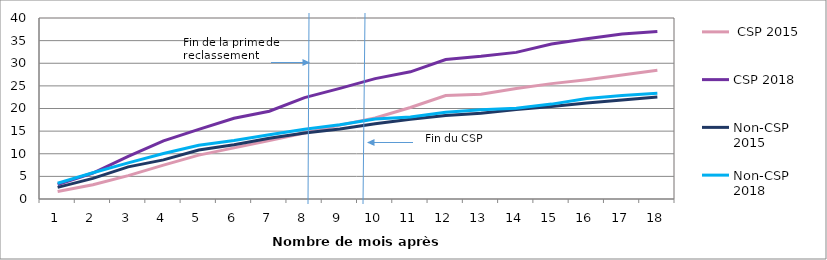
| Category |  CSP 2015 | CSP 2018 | Non-CSP 2015 | Non-CSP 2018 |
|---|---|---|---|---|
| 0 | 1.667 | 3.194 | 2.561 | 3.484 |
| 1 | 3.167 | 5.749 | 4.545 | 5.806 |
| 2 | 5.166 | 9.408 | 7.106 | 7.992 |
| 3 | 7.5 | 12.834 | 8.643 | 10.041 |
| 4 | 9.7 | 15.389 | 10.819 | 11.885 |
| 5 | 11.3 | 17.828 | 11.972 | 12.91 |
| 6 | 12.933 | 19.396 | 13.444 | 14.208 |
| 7 | 14.6 | 22.416 | 14.597 | 15.437 |
| 8 | 16.333 | 24.448 | 15.493 | 16.393 |
| 9 | 17.899 | 26.597 | 16.645 | 17.691 |
| 10 | 20.233 | 28.107 | 17.606 | 18.101 |
| 11 | 22.866 | 30.836 | 18.438 | 19.194 |
| 12 | 23.133 | 31.533 | 18.95 | 19.74 |
| 13 | 24.433 | 32.404 | 19.782 | 20.082 |
| 14 | 25.499 | 34.262 | 20.423 | 20.97 |
| 15 | 26.366 | 35.424 | 21.191 | 22.199 |
| 16 | 27.399 | 36.469 | 21.895 | 22.883 |
| 17 | 28.432 | 36.992 | 22.535 | 23.361 |